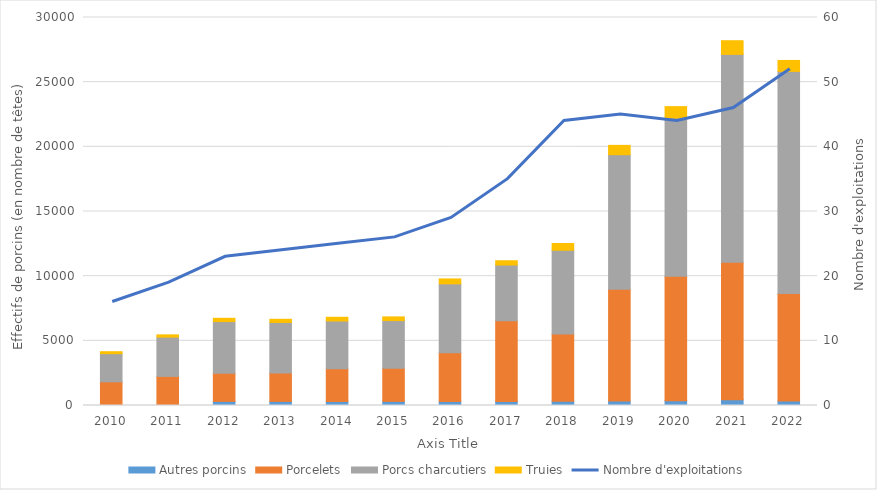
| Category | Autres porcins | Porcelets | Porcs charcutiers | Truies |
|---|---|---|---|---|
| 2010.0 | 11 | 1822 | 2174 | 153 |
| 2011.0 | 12 | 2240 | 3031 | 179 |
| 2012.0 | 317 | 2177 | 3994 | 254 |
| 2013.0 | 316 | 2202 | 3903 | 244 |
| 2014.0 | 309 | 2535 | 3690 | 288 |
| 2015.0 | 317 | 2567 | 3683 | 284 |
| 2016.0 | 318 | 3769 | 5319 | 381 |
| 2017.0 | 318 | 6230 | 4312 | 333 |
| 2018.0 | 336 | 5201 | 6467 | 520 |
| 2019.0 | 341 | 8654 | 10396 | 722 |
| 2020.0 | 376 | 9609 | 12230 | 894 |
| 2021.0 | 438 | 10629 | 16082 | 1057 |
| 2022.0 | 351 | 8306 | 17177 | 845 |